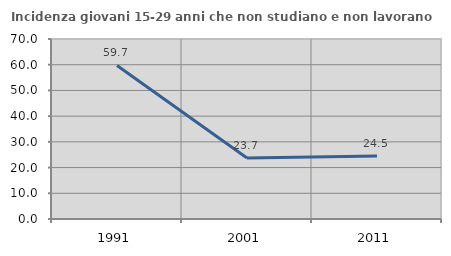
| Category | Incidenza giovani 15-29 anni che non studiano e non lavorano  |
|---|---|
| 1991.0 | 59.718 |
| 2001.0 | 23.709 |
| 2011.0 | 24.523 |